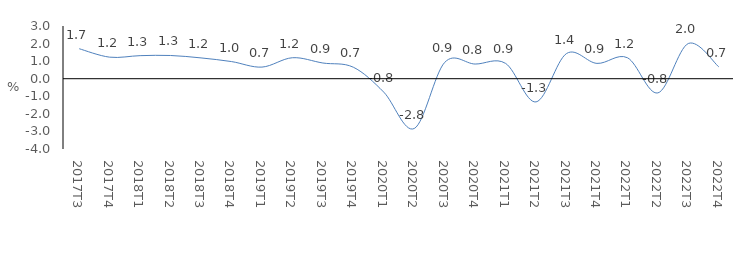
| Category | Series 0 |
|---|---|
| 2017Τ3 | 1.707 |
| 2017Τ4 | 1.226 |
| 2018Τ1 | 1.313 |
| 2018Τ2 | 1.322 |
| 2018Τ3 | 1.184 |
| 2018Τ4 | 0.976 |
| 2019Τ1 | 0.661 |
| 2019Τ2 | 1.194 |
| 2019Τ3 | 0.894 |
| 2019Τ4 | 0.655 |
| 2020Τ1 | -0.765 |
| 2020Τ2 | -2.835 |
| 2020Τ3 | 0.928 |
| 2020Τ4 | 0.835 |
| 2021Τ1 | 0.872 |
| 2021Τ2 | -1.32 |
| 2021Τ3 | 1.432 |
| 2021Τ4 | 0.872 |
| 2022Τ1 | 1.195 |
| 2022Τ2 | -0.808 |
| 2022Τ3 | 2.004 |
| 2022Τ4 | 0.676 |